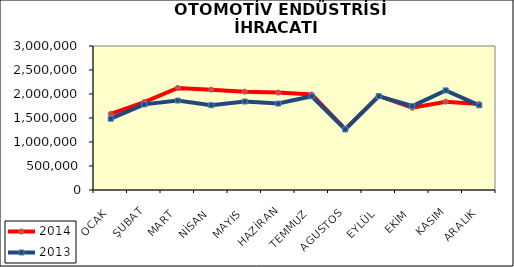
| Category | 2014 | 2013 |
|---|---|---|
| OCAK | 1585958.43 | 1485459.331 |
| ŞUBAT | 1832639.84 | 1783951.888 |
| MART | 2126496.683 | 1863298.677 |
| NİSAN | 2089962.94 | 1766370.998 |
| MAYIS | 2048814.024 | 1843125.467 |
| HAZİRAN | 2029809.44 | 1800469.289 |
| TEMMUZ | 1988785.55 | 1952618.523 |
| AGUSTOS | 1266790.658 | 1263006.966 |
| EYLÜL | 1958597.95 | 1955643.449 |
| EKİM | 1712963.077 | 1749427.511 |
| KASIM | 1839926.801 | 2075518.764 |
| ARALIK | 1789926.501 | 1764236.761 |